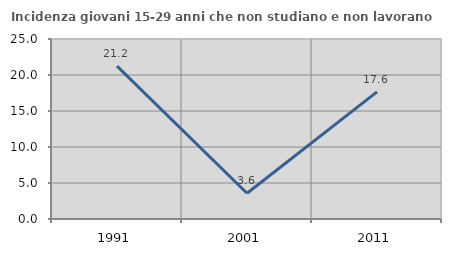
| Category | Incidenza giovani 15-29 anni che non studiano e non lavorano  |
|---|---|
| 1991.0 | 21.239 |
| 2001.0 | 3.571 |
| 2011.0 | 17.647 |